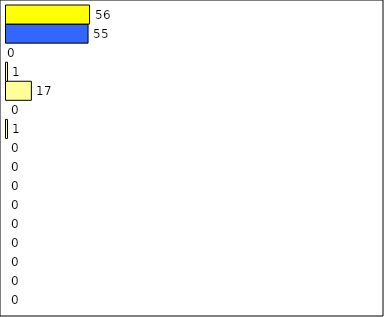
| Category | -2 | -1 | 0 | 1 | 2 | 3 | 4 | 5 | 6 | 7 | 8 | 9 | 10 | 11 | 12 | Perfect Round |
|---|---|---|---|---|---|---|---|---|---|---|---|---|---|---|---|---|
| 0 | 0 | 0 | 0 | 0 | 0 | 0 | 0 | 0 | 0 | 1 | 0 | 17 | 1 | 0 | 55 | 56 |